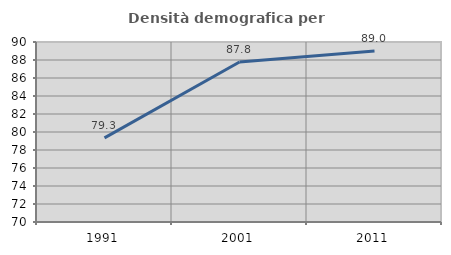
| Category | Densità demografica |
|---|---|
| 1991.0 | 79.348 |
| 2001.0 | 87.772 |
| 2011.0 | 88.993 |